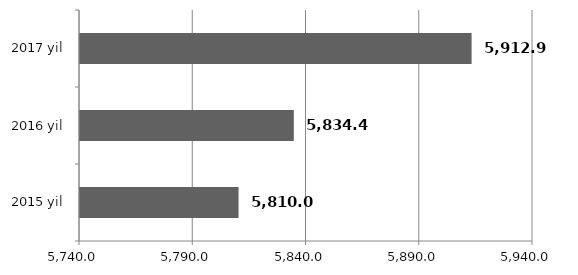
| Category | Series 0 |
|---|---|
| 2015 yil | 5810 |
| 2016 yil | 5834.4 |
| 2017 yil | 5912.89 |